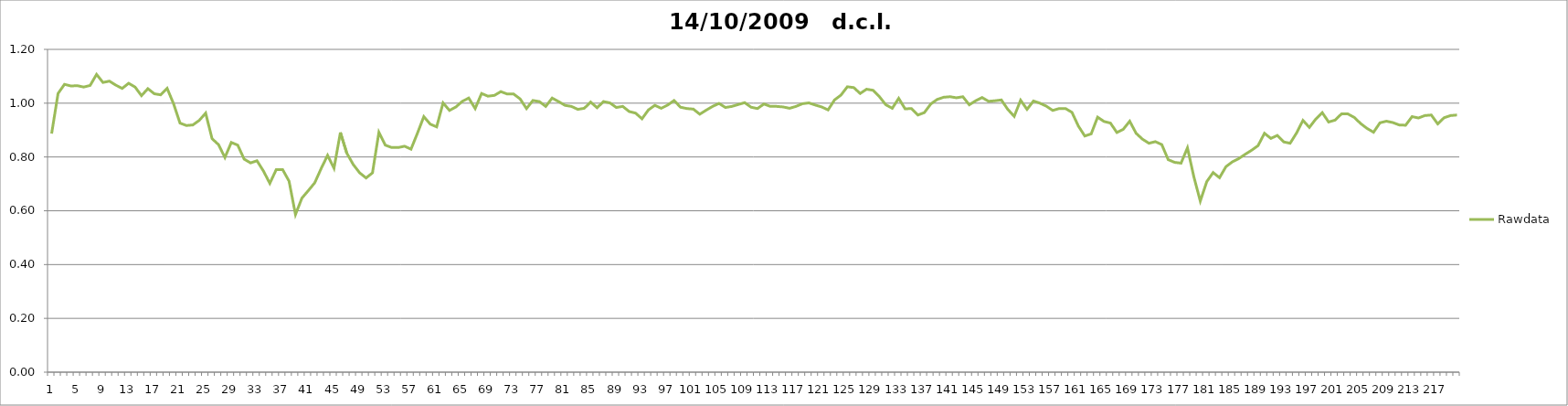
| Category | Rawdata |
|---|---|
| 0 | 0.887 |
| 1 | 1.036 |
| 2 | 1.07 |
| 3 | 1.064 |
| 4 | 1.065 |
| 5 | 1.06 |
| 6 | 1.066 |
| 7 | 1.107 |
| 8 | 1.077 |
| 9 | 1.082 |
| 10 | 1.067 |
| 11 | 1.055 |
| 12 | 1.074 |
| 13 | 1.06 |
| 14 | 1.028 |
| 15 | 1.054 |
| 16 | 1.035 |
| 17 | 1.031 |
| 18 | 1.055 |
| 19 | 0.998 |
| 20 | 0.926 |
| 21 | 0.917 |
| 22 | 0.919 |
| 23 | 0.936 |
| 24 | 0.963 |
| 25 | 0.868 |
| 26 | 0.846 |
| 27 | 0.798 |
| 28 | 0.854 |
| 29 | 0.844 |
| 30 | 0.792 |
| 31 | 0.778 |
| 32 | 0.786 |
| 33 | 0.748 |
| 34 | 0.702 |
| 35 | 0.753 |
| 36 | 0.753 |
| 37 | 0.71 |
| 38 | 0.586 |
| 39 | 0.647 |
| 40 | 0.675 |
| 41 | 0.704 |
| 42 | 0.757 |
| 43 | 0.806 |
| 44 | 0.758 |
| 45 | 0.891 |
| 46 | 0.814 |
| 47 | 0.772 |
| 48 | 0.741 |
| 49 | 0.722 |
| 50 | 0.741 |
| 51 | 0.892 |
| 52 | 0.844 |
| 53 | 0.835 |
| 54 | 0.835 |
| 55 | 0.84 |
| 56 | 0.829 |
| 57 | 0.888 |
| 58 | 0.95 |
| 59 | 0.922 |
| 60 | 0.912 |
| 61 | 1.001 |
| 62 | 0.973 |
| 63 | 0.986 |
| 64 | 1.007 |
| 65 | 1.019 |
| 66 | 0.98 |
| 67 | 1.036 |
| 68 | 1.026 |
| 69 | 1.029 |
| 70 | 1.043 |
| 71 | 1.034 |
| 72 | 1.034 |
| 73 | 1.016 |
| 74 | 0.98 |
| 75 | 1.01 |
| 76 | 1.006 |
| 77 | 0.988 |
| 78 | 1.019 |
| 79 | 1.006 |
| 80 | 0.992 |
| 81 | 0.988 |
| 82 | 0.977 |
| 83 | 0.981 |
| 84 | 1.004 |
| 85 | 0.983 |
| 86 | 1.006 |
| 87 | 1.001 |
| 88 | 0.984 |
| 89 | 0.988 |
| 90 | 0.969 |
| 91 | 0.963 |
| 92 | 0.942 |
| 93 | 0.975 |
| 94 | 0.992 |
| 95 | 0.981 |
| 96 | 0.993 |
| 97 | 1.01 |
| 98 | 0.985 |
| 99 | 0.98 |
| 100 | 0.978 |
| 101 | 0.959 |
| 102 | 0.974 |
| 103 | 0.988 |
| 104 | 0.999 |
| 105 | 0.984 |
| 106 | 0.988 |
| 107 | 0.995 |
| 108 | 1.002 |
| 109 | 0.985 |
| 110 | 0.98 |
| 111 | 0.997 |
| 112 | 0.988 |
| 113 | 0.988 |
| 114 | 0.986 |
| 115 | 0.981 |
| 116 | 0.988 |
| 117 | 0.998 |
| 118 | 1.001 |
| 119 | 0.993 |
| 120 | 0.986 |
| 121 | 0.975 |
| 122 | 1.012 |
| 123 | 1.03 |
| 124 | 1.061 |
| 125 | 1.058 |
| 126 | 1.036 |
| 127 | 1.052 |
| 128 | 1.048 |
| 129 | 1.024 |
| 130 | 0.994 |
| 131 | 0.981 |
| 132 | 1.018 |
| 133 | 0.979 |
| 134 | 0.98 |
| 135 | 0.956 |
| 136 | 0.965 |
| 137 | 0.997 |
| 138 | 1.014 |
| 139 | 1.022 |
| 140 | 1.024 |
| 141 | 1.02 |
| 142 | 1.024 |
| 143 | 0.994 |
| 144 | 1.009 |
| 145 | 1.021 |
| 146 | 1.007 |
| 147 | 1.009 |
| 148 | 1.012 |
| 149 | 0.977 |
| 150 | 0.951 |
| 151 | 1.011 |
| 152 | 0.977 |
| 153 | 1.008 |
| 154 | 1 |
| 155 | 0.989 |
| 156 | 0.973 |
| 157 | 0.98 |
| 158 | 0.98 |
| 159 | 0.966 |
| 160 | 0.915 |
| 161 | 0.878 |
| 162 | 0.886 |
| 163 | 0.948 |
| 164 | 0.932 |
| 165 | 0.926 |
| 166 | 0.891 |
| 167 | 0.903 |
| 168 | 0.933 |
| 169 | 0.888 |
| 170 | 0.866 |
| 171 | 0.851 |
| 172 | 0.857 |
| 173 | 0.846 |
| 174 | 0.79 |
| 175 | 0.78 |
| 176 | 0.777 |
| 177 | 0.834 |
| 178 | 0.726 |
| 179 | 0.636 |
| 180 | 0.708 |
| 181 | 0.742 |
| 182 | 0.723 |
| 183 | 0.764 |
| 184 | 0.782 |
| 185 | 0.794 |
| 186 | 0.81 |
| 187 | 0.825 |
| 188 | 0.842 |
| 189 | 0.888 |
| 190 | 0.869 |
| 191 | 0.88 |
| 192 | 0.856 |
| 193 | 0.851 |
| 194 | 0.889 |
| 195 | 0.936 |
| 196 | 0.91 |
| 197 | 0.941 |
| 198 | 0.965 |
| 199 | 0.93 |
| 200 | 0.937 |
| 201 | 0.96 |
| 202 | 0.96 |
| 203 | 0.947 |
| 204 | 0.924 |
| 205 | 0.906 |
| 206 | 0.892 |
| 207 | 0.927 |
| 208 | 0.933 |
| 209 | 0.928 |
| 210 | 0.919 |
| 211 | 0.918 |
| 212 | 0.95 |
| 213 | 0.945 |
| 214 | 0.954 |
| 215 | 0.956 |
| 216 | 0.923 |
| 217 | 0.946 |
| 218 | 0.954 |
| 219 | 0.956 |